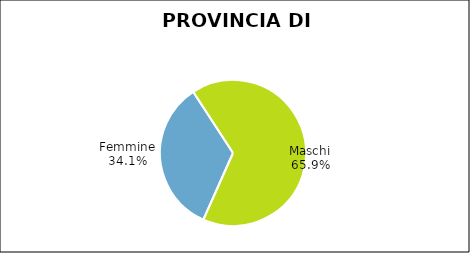
| Category | Provincia di Varese |
|---|---|
| Femmine | 21028 |
| Maschi | 40551 |